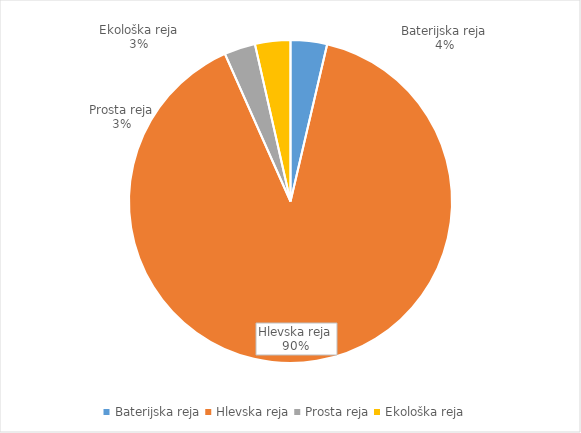
| Category | Količina kosov jajc |
|---|---|
| Baterijska reja | 84800 |
| Hlevska reja | 2085258 |
| Prosta reja | 72390 |
| Ekološka reja | 82320 |